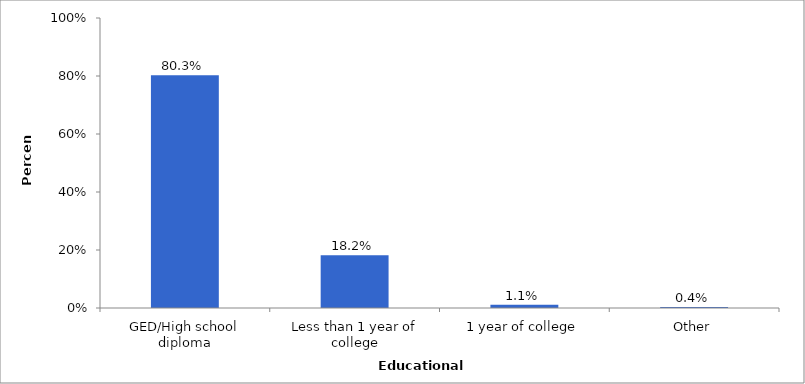
| Category | Series 0 |
|---|---|
| GED/High school diploma | 0.803 |
| Less than 1 year of college | 0.182 |
| 1 year of college | 0.011 |
| Other | 0.004 |